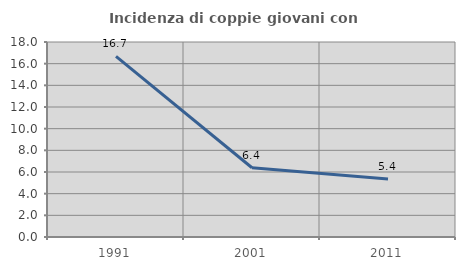
| Category | Incidenza di coppie giovani con figli |
|---|---|
| 1991.0 | 16.667 |
| 2001.0 | 6.39 |
| 2011.0 | 5.363 |